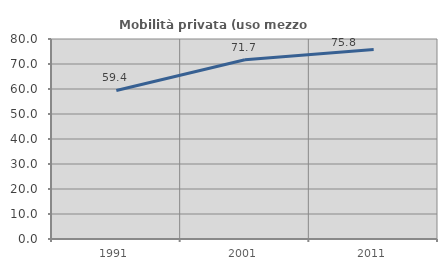
| Category | Mobilità privata (uso mezzo privato) |
|---|---|
| 1991.0 | 59.42 |
| 2001.0 | 71.692 |
| 2011.0 | 75.765 |